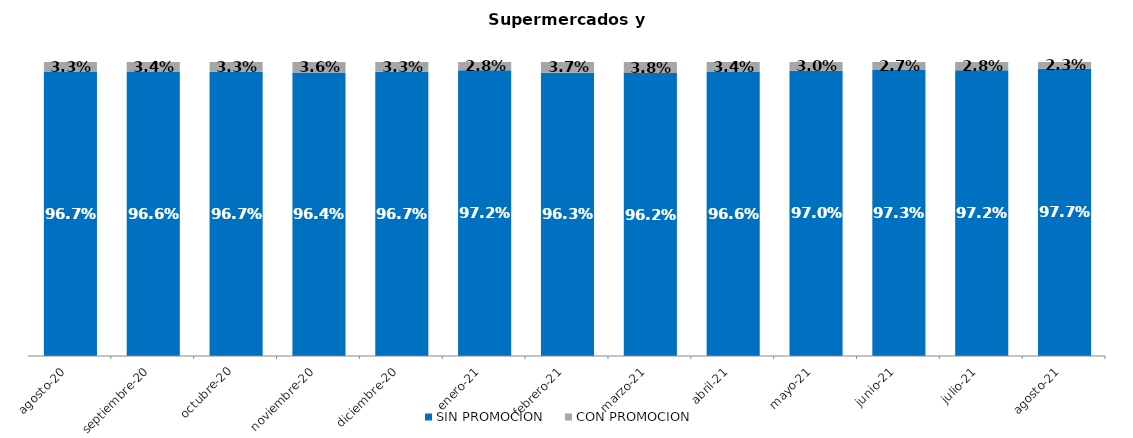
| Category | SIN PROMOCION   | CON PROMOCION   |
|---|---|---|
| 2020-08-01 | 0.967 | 0.033 |
| 2020-09-01 | 0.966 | 0.034 |
| 2020-10-01 | 0.967 | 0.033 |
| 2020-11-01 | 0.964 | 0.036 |
| 2020-12-01 | 0.967 | 0.033 |
| 2021-01-01 | 0.972 | 0.028 |
| 2021-02-01 | 0.963 | 0.037 |
| 2021-03-01 | 0.962 | 0.038 |
| 2021-04-01 | 0.966 | 0.034 |
| 2021-05-01 | 0.97 | 0.03 |
| 2021-06-01 | 0.973 | 0.027 |
| 2021-07-01 | 0.972 | 0.028 |
| 2021-08-01 | 0.977 | 0.023 |